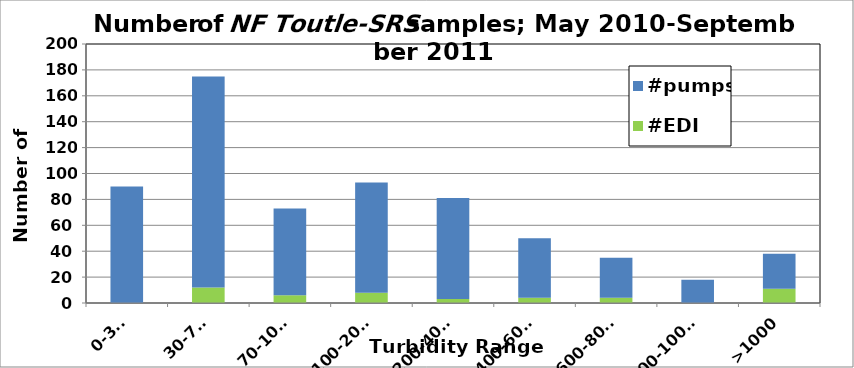
| Category | #EDI | #pumps |
|---|---|---|
| 0-30, | 0 | 90 |
| 30-70, | 12 | 163 |
| 70-100, | 6 | 67 |
| 100-200, | 8 | 85 |
| 200-400, | 3 | 78 |
| 400-600, | 4 | 46 |
| 600-800, | 4 | 31 |
| 800-1000, | 0 | 18 |
| >1000 | 11 | 27 |